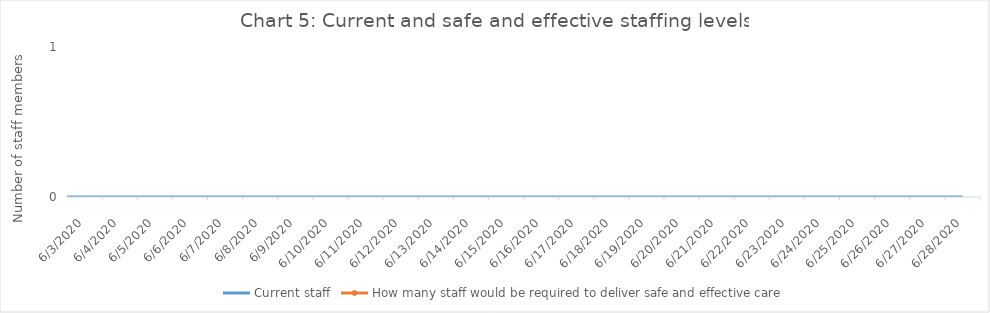
| Category | Current staff | How many staff would be required to deliver safe and effective care  |
|---|---|---|
| 6/3/20 | 0 |  |
| 6/4/20 | 0 |  |
| 6/5/20 | 0 |  |
| 6/6/20 | 0 |  |
| 6/7/20 | 0 |  |
| 6/8/20 | 0 |  |
| 6/9/20 | 0 |  |
| 6/10/20 | 0 |  |
| 6/11/20 | 0 |  |
| 6/12/20 | 0 |  |
| 6/13/20 | 0 |  |
| 6/14/20 | 0 |  |
| 6/15/20 | 0 |  |
| 6/16/20 | 0 |  |
| 6/17/20 | 0 |  |
| 6/18/20 | 0 |  |
| 6/19/20 | 0 |  |
| 6/20/20 | 0 |  |
| 6/21/20 | 0 |  |
| 6/22/20 | 0 |  |
| 6/23/20 | 0 |  |
| 6/24/20 | 0 |  |
| 6/25/20 | 0 |  |
| 6/26/20 | 0 |  |
| 6/27/20 | 0 |  |
| 6/28/20 | 0 |  |
| nan | 0 |  |
| nan | 0 |  |
| nan | 0 |  |
| nan | 0 |  |
| nan | 0 |  |
| nan | 0 |  |
| nan | 0 |  |
| nan | 0 |  |
| nan | 0 |  |
| nan | 0 |  |
| nan | 0 |  |
| nan | 0 |  |
| nan | 0 |  |
| nan | 0 |  |
| nan | 0 |  |
| nan | 0 |  |
| nan | 0 |  |
| nan | 0 |  |
| nan | 0 |  |
| nan | 0 |  |
| nan | 0 |  |
| nan | 0 |  |
| nan | 0 |  |
| nan | 0 |  |
| nan | 0 |  |
| nan | 0 |  |
| nan | 0 |  |
| nan | 0 |  |
| nan | 0 |  |
| nan | 0 |  |
| nan | 0 |  |
| nan | 0 |  |
| nan | 0 |  |
| nan | 0 |  |
| nan | 0 |  |
| nan | 0 |  |
| nan | 0 |  |
| nan | 0 |  |
| nan | 0 |  |
| nan | 0 |  |
| nan | 0 |  |
| nan | 0 |  |
| nan | 0 |  |
| nan | 0 |  |
| nan | 0 |  |
| nan | 0 |  |
| nan | 0 |  |
| nan | 0 |  |
| nan | 0 |  |
| nan | 0 |  |